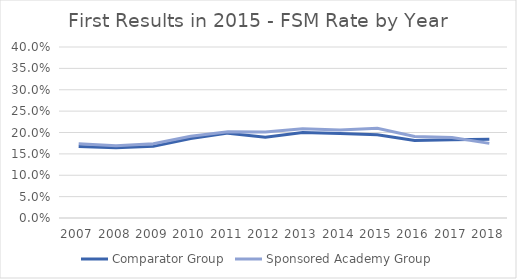
| Category | Comparator Group | Sponsored Academy Group |
|---|---|---|
| 2007.0 | 0.168 | 0.174 |
| 2008.0 | 0.164 | 0.169 |
| 2009.0 | 0.168 | 0.174 |
| 2010.0 | 0.186 | 0.191 |
| 2011.0 | 0.199 | 0.202 |
| 2012.0 | 0.189 | 0.201 |
| 2013.0 | 0.2 | 0.209 |
| 2014.0 | 0.198 | 0.206 |
| 2015.0 | 0.195 | 0.21 |
| 2016.0 | 0.182 | 0.191 |
| 2017.0 | 0.183 | 0.188 |
| 2018.0 | 0.184 | 0.175 |